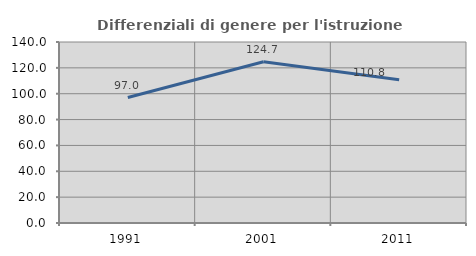
| Category | Differenziali di genere per l'istruzione superiore |
|---|---|
| 1991.0 | 97.046 |
| 2001.0 | 124.687 |
| 2011.0 | 110.843 |